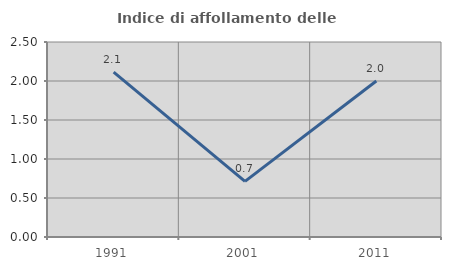
| Category | Indice di affollamento delle abitazioni  |
|---|---|
| 1991.0 | 2.115 |
| 2001.0 | 0.713 |
| 2011.0 | 2 |